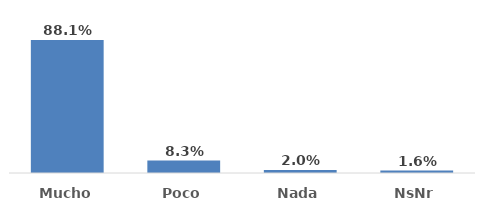
| Category | Series 0 |
|---|---|
| Mucho  | 0.881 |
| Poco | 0.083 |
| Nada | 0.02 |
| NsNr | 0.016 |